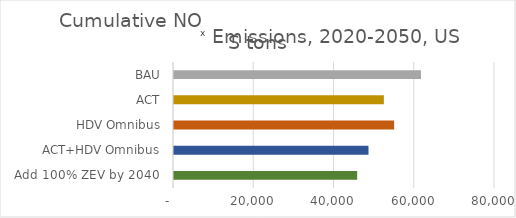
| Category | Cumulative NOx Emissions, 2020-2050, US tons |
|---|---|
|  Add 100% ZEV by 2040  | 45649.771 |
| ACT+HDV Omnibus | 48470 |
| HDV Omnibus | 54870 |
| ACT | 52300 |
| BAU | 61550 |